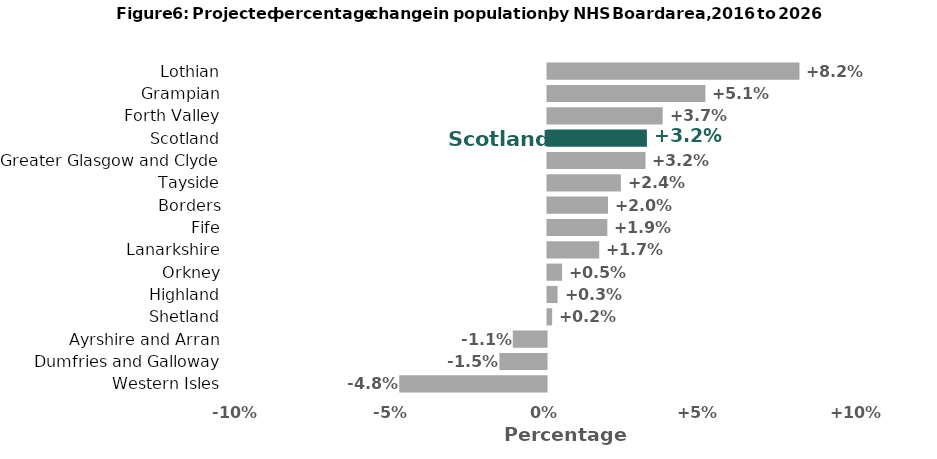
| Category | Percentage change |
|---|---|
| Western Isles | -4.773 |
| Dumfries and Galloway | -1.529 |
| Ayrshire and Arran | -1.092 |
| Shetland | 0.151 |
| Highland | 0.326 |
| Orkney | 0.471 |
| Lanarkshire | 1.677 |
| Fife | 1.939 |
| Borders | 1.962 |
| Tayside | 2.379 |
| Greater Glasgow and Clyde | 3.176 |
| Scotland | 3.222 |
| Forth Valley | 3.734 |
| Grampian | 5.118 |
| Lothian | 8.168 |